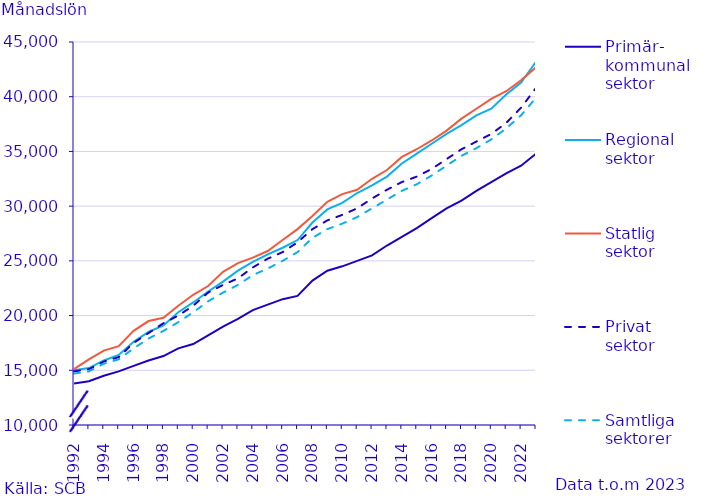
| Category | Primär-
kommunal
sektor | Regional
sektor | Statlig
sektor | Privat
sektor | Samtliga
sektorer |
|---|---|---|---|---|---|
| 1992.0 | 13800 | 15000 | 15100 | 14900 | 14700 |
| 1993.0 | 14000 | 15200 | 16000 | 15100 | 14900 |
| 1994.0 | 14500 | 15900 | 16800 | 15800 | 15600 |
| 1995.0 | 14900 | 16400 | 17200 | 16200 | 16000 |
| 1996.0 | 15400 | 17600 | 18600 | 17500 | 17000 |
| 1997.0 | 15900 | 18500 | 19500 | 18400 | 17900 |
| 1998.0 | 16300 | 19100 | 19800 | 19300 | 18600 |
| 1999.0 | 17000 | 20300 | 20900 | 20000 | 19400 |
| 2000.0 | 17400 | 21200 | 21900 | 20900 | 20300 |
| 2001.0 | 18200 | 22200 | 22700 | 22100 | 21300 |
| 2002.0 | 19000 | 23100 | 24000 | 22800 | 22100 |
| 2003.0 | 19700 | 24100 | 24800 | 23400 | 22800 |
| 2004.0 | 20500 | 24900 | 25300 | 24400 | 23700 |
| 2005.0 | 21000 | 25600 | 25900 | 25200 | 24300 |
| 2006.0 | 21500 | 26200 | 26900 | 25800 | 25000 |
| 2007.0 | 21800 | 26900 | 27900 | 26700 | 25800 |
| 2008.0 | 23200 | 28500 | 29100 | 27900 | 27100 |
| 2009.0 | 24100 | 29700 | 30400 | 28700 | 27900 |
| 2010.0 | 24500 | 30300 | 31100 | 29200 | 28400 |
| 2011.0 | 25000 | 31200 | 31500 | 29800 | 29000 |
| 2012.0 | 25500 | 31900 | 32500 | 30700 | 29800 |
| 2013.0 | 26400 | 32700 | 33300 | 31500 | 30600 |
| 2014.0 | 27200 | 33900 | 34500 | 32200 | 31400 |
| 2015.0 | 28000 | 34800 | 35200 | 32700 | 32000 |
| 2016.0 | 28900 | 35700 | 36000 | 33400 | 32800 |
| 2017.0 | 29800 | 36600 | 36900 | 34300 | 33700 |
| 2018.0 | 30500 | 37400 | 38000 | 35200 | 34600 |
| 2019.0 | 31400 | 38300 | 38900 | 35900 | 35300 |
| 2020.0 | 32200 | 38900 | 39800 | 36600 | 36100 |
| 2021.0 | 33000 | 40200 | 40500 | 37600 | 37100 |
| 2022.0 | 33700 | 41300 | 41500 | 39000 | 38300 |
| 2023.0 | 34800 | 43200 | 42700 | 40800 | 39900 |